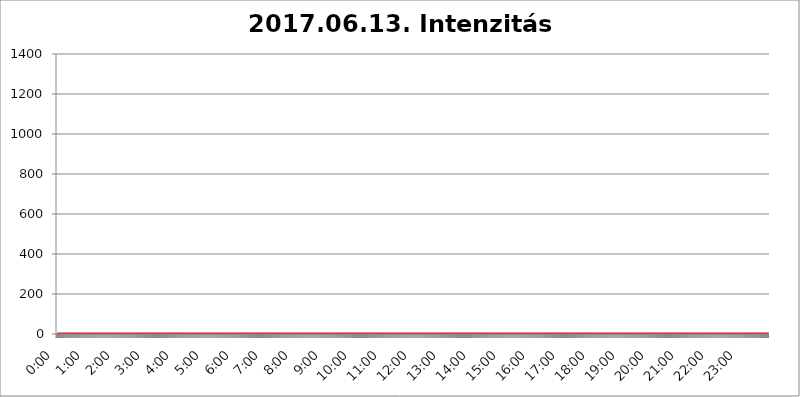
| Category | 2017.06.13. Intenzitás [W/m^2] |
|---|---|
| 0.0 | 0 |
| 0.0006944444444444445 | 0 |
| 0.001388888888888889 | 0 |
| 0.0020833333333333333 | 0 |
| 0.002777777777777778 | 0 |
| 0.003472222222222222 | 0 |
| 0.004166666666666667 | 0 |
| 0.004861111111111111 | 0 |
| 0.005555555555555556 | 0 |
| 0.0062499999999999995 | 0 |
| 0.006944444444444444 | 0 |
| 0.007638888888888889 | 0 |
| 0.008333333333333333 | 0 |
| 0.009027777777777779 | 0 |
| 0.009722222222222222 | 0 |
| 0.010416666666666666 | 0 |
| 0.011111111111111112 | 0 |
| 0.011805555555555555 | 0 |
| 0.012499999999999999 | 0 |
| 0.013194444444444444 | 0 |
| 0.013888888888888888 | 0 |
| 0.014583333333333332 | 0 |
| 0.015277777777777777 | 0 |
| 0.015972222222222224 | 0 |
| 0.016666666666666666 | 0 |
| 0.017361111111111112 | 0 |
| 0.018055555555555557 | 0 |
| 0.01875 | 0 |
| 0.019444444444444445 | 0 |
| 0.02013888888888889 | 0 |
| 0.020833333333333332 | 0 |
| 0.02152777777777778 | 0 |
| 0.022222222222222223 | 0 |
| 0.02291666666666667 | 0 |
| 0.02361111111111111 | 0 |
| 0.024305555555555556 | 0 |
| 0.024999999999999998 | 0 |
| 0.025694444444444447 | 0 |
| 0.02638888888888889 | 0 |
| 0.027083333333333334 | 0 |
| 0.027777777777777776 | 0 |
| 0.02847222222222222 | 0 |
| 0.029166666666666664 | 0 |
| 0.029861111111111113 | 0 |
| 0.030555555555555555 | 0 |
| 0.03125 | 0 |
| 0.03194444444444445 | 0 |
| 0.03263888888888889 | 0 |
| 0.03333333333333333 | 0 |
| 0.034027777777777775 | 0 |
| 0.034722222222222224 | 0 |
| 0.035416666666666666 | 0 |
| 0.036111111111111115 | 0 |
| 0.03680555555555556 | 0 |
| 0.0375 | 0 |
| 0.03819444444444444 | 0 |
| 0.03888888888888889 | 0 |
| 0.03958333333333333 | 0 |
| 0.04027777777777778 | 0 |
| 0.04097222222222222 | 0 |
| 0.041666666666666664 | 0 |
| 0.042361111111111106 | 0 |
| 0.04305555555555556 | 0 |
| 0.043750000000000004 | 0 |
| 0.044444444444444446 | 0 |
| 0.04513888888888889 | 0 |
| 0.04583333333333334 | 0 |
| 0.04652777777777778 | 0 |
| 0.04722222222222222 | 0 |
| 0.04791666666666666 | 0 |
| 0.04861111111111111 | 0 |
| 0.049305555555555554 | 0 |
| 0.049999999999999996 | 0 |
| 0.05069444444444445 | 0 |
| 0.051388888888888894 | 0 |
| 0.052083333333333336 | 0 |
| 0.05277777777777778 | 0 |
| 0.05347222222222222 | 0 |
| 0.05416666666666667 | 0 |
| 0.05486111111111111 | 0 |
| 0.05555555555555555 | 0 |
| 0.05625 | 0 |
| 0.05694444444444444 | 0 |
| 0.057638888888888885 | 0 |
| 0.05833333333333333 | 0 |
| 0.05902777777777778 | 0 |
| 0.059722222222222225 | 0 |
| 0.06041666666666667 | 0 |
| 0.061111111111111116 | 0 |
| 0.06180555555555556 | 0 |
| 0.0625 | 0 |
| 0.06319444444444444 | 0 |
| 0.06388888888888888 | 0 |
| 0.06458333333333334 | 0 |
| 0.06527777777777778 | 0 |
| 0.06597222222222222 | 0 |
| 0.06666666666666667 | 0 |
| 0.06736111111111111 | 0 |
| 0.06805555555555555 | 0 |
| 0.06874999999999999 | 0 |
| 0.06944444444444443 | 0 |
| 0.07013888888888889 | 0 |
| 0.07083333333333333 | 0 |
| 0.07152777777777779 | 0 |
| 0.07222222222222223 | 0 |
| 0.07291666666666667 | 0 |
| 0.07361111111111111 | 0 |
| 0.07430555555555556 | 0 |
| 0.075 | 0 |
| 0.07569444444444444 | 0 |
| 0.0763888888888889 | 0 |
| 0.07708333333333334 | 0 |
| 0.07777777777777778 | 0 |
| 0.07847222222222222 | 0 |
| 0.07916666666666666 | 0 |
| 0.0798611111111111 | 0 |
| 0.08055555555555556 | 0 |
| 0.08125 | 0 |
| 0.08194444444444444 | 0 |
| 0.08263888888888889 | 0 |
| 0.08333333333333333 | 0 |
| 0.08402777777777777 | 0 |
| 0.08472222222222221 | 0 |
| 0.08541666666666665 | 0 |
| 0.08611111111111112 | 0 |
| 0.08680555555555557 | 0 |
| 0.08750000000000001 | 0 |
| 0.08819444444444445 | 0 |
| 0.08888888888888889 | 0 |
| 0.08958333333333333 | 0 |
| 0.09027777777777778 | 0 |
| 0.09097222222222222 | 0 |
| 0.09166666666666667 | 0 |
| 0.09236111111111112 | 0 |
| 0.09305555555555556 | 0 |
| 0.09375 | 0 |
| 0.09444444444444444 | 0 |
| 0.09513888888888888 | 0 |
| 0.09583333333333333 | 0 |
| 0.09652777777777777 | 0 |
| 0.09722222222222222 | 0 |
| 0.09791666666666667 | 0 |
| 0.09861111111111111 | 0 |
| 0.09930555555555555 | 0 |
| 0.09999999999999999 | 0 |
| 0.10069444444444443 | 0 |
| 0.1013888888888889 | 0 |
| 0.10208333333333335 | 0 |
| 0.10277777777777779 | 0 |
| 0.10347222222222223 | 0 |
| 0.10416666666666667 | 0 |
| 0.10486111111111111 | 0 |
| 0.10555555555555556 | 0 |
| 0.10625 | 0 |
| 0.10694444444444444 | 0 |
| 0.1076388888888889 | 0 |
| 0.10833333333333334 | 0 |
| 0.10902777777777778 | 0 |
| 0.10972222222222222 | 0 |
| 0.1111111111111111 | 0 |
| 0.11180555555555556 | 0 |
| 0.11180555555555556 | 0 |
| 0.1125 | 0 |
| 0.11319444444444444 | 0 |
| 0.11388888888888889 | 0 |
| 0.11458333333333333 | 0 |
| 0.11527777777777777 | 0 |
| 0.11597222222222221 | 0 |
| 0.11666666666666665 | 0 |
| 0.1173611111111111 | 0 |
| 0.11805555555555557 | 0 |
| 0.11944444444444445 | 0 |
| 0.12013888888888889 | 0 |
| 0.12083333333333333 | 0 |
| 0.12152777777777778 | 0 |
| 0.12222222222222223 | 0 |
| 0.12291666666666667 | 0 |
| 0.12291666666666667 | 0 |
| 0.12361111111111112 | 0 |
| 0.12430555555555556 | 0 |
| 0.125 | 0 |
| 0.12569444444444444 | 0 |
| 0.12638888888888888 | 0 |
| 0.12708333333333333 | 0 |
| 0.16875 | 0 |
| 0.12847222222222224 | 0 |
| 0.12916666666666668 | 0 |
| 0.12986111111111112 | 0 |
| 0.13055555555555556 | 0 |
| 0.13125 | 0 |
| 0.13194444444444445 | 0 |
| 0.1326388888888889 | 0 |
| 0.13333333333333333 | 0 |
| 0.13402777777777777 | 0 |
| 0.13402777777777777 | 0 |
| 0.13472222222222222 | 0 |
| 0.13541666666666666 | 0 |
| 0.1361111111111111 | 0 |
| 0.13749999999999998 | 0 |
| 0.13819444444444443 | 0 |
| 0.1388888888888889 | 0 |
| 0.13958333333333334 | 0 |
| 0.14027777777777778 | 0 |
| 0.14097222222222222 | 0 |
| 0.14166666666666666 | 0 |
| 0.1423611111111111 | 0 |
| 0.14305555555555557 | 0 |
| 0.14375000000000002 | 0 |
| 0.14444444444444446 | 0 |
| 0.1451388888888889 | 0 |
| 0.1451388888888889 | 0 |
| 0.14652777777777778 | 0 |
| 0.14722222222222223 | 0 |
| 0.14791666666666667 | 0 |
| 0.1486111111111111 | 0 |
| 0.14930555555555555 | 0 |
| 0.15 | 0 |
| 0.15069444444444444 | 0 |
| 0.15138888888888888 | 0 |
| 0.15208333333333332 | 0 |
| 0.15277777777777776 | 0 |
| 0.15347222222222223 | 0 |
| 0.15416666666666667 | 0 |
| 0.15486111111111112 | 0 |
| 0.15555555555555556 | 0 |
| 0.15625 | 0 |
| 0.15694444444444444 | 0 |
| 0.15763888888888888 | 0 |
| 0.15833333333333333 | 0 |
| 0.15902777777777777 | 0 |
| 0.15972222222222224 | 0 |
| 0.16041666666666668 | 0 |
| 0.16111111111111112 | 0 |
| 0.16180555555555556 | 0 |
| 0.1625 | 0 |
| 0.16319444444444445 | 0 |
| 0.1638888888888889 | 0 |
| 0.16458333333333333 | 0 |
| 0.16527777777777777 | 0 |
| 0.16597222222222222 | 0 |
| 0.16666666666666666 | 0 |
| 0.1673611111111111 | 0 |
| 0.16805555555555554 | 0 |
| 0.16874999999999998 | 0 |
| 0.16944444444444443 | 0 |
| 0.17013888888888887 | 0 |
| 0.1708333333333333 | 0 |
| 0.17152777777777775 | 0 |
| 0.17222222222222225 | 0 |
| 0.1729166666666667 | 0 |
| 0.17361111111111113 | 0 |
| 0.17430555555555557 | 0 |
| 0.17500000000000002 | 0 |
| 0.17569444444444446 | 0 |
| 0.1763888888888889 | 0 |
| 0.17708333333333334 | 0 |
| 0.17777777777777778 | 0 |
| 0.17847222222222223 | 0 |
| 0.17916666666666667 | 0 |
| 0.1798611111111111 | 0 |
| 0.18055555555555555 | 0 |
| 0.18125 | 0 |
| 0.18194444444444444 | 0 |
| 0.1826388888888889 | 0 |
| 0.18333333333333335 | 0 |
| 0.1840277777777778 | 0 |
| 0.18472222222222223 | 0 |
| 0.18541666666666667 | 0 |
| 0.18611111111111112 | 0 |
| 0.18680555555555556 | 0 |
| 0.1875 | 0 |
| 0.18819444444444444 | 0 |
| 0.18888888888888888 | 0 |
| 0.18958333333333333 | 0 |
| 0.19027777777777777 | 0 |
| 0.1909722222222222 | 0 |
| 0.19166666666666665 | 0 |
| 0.19236111111111112 | 0 |
| 0.19305555555555554 | 0 |
| 0.19375 | 0 |
| 0.19444444444444445 | 0 |
| 0.1951388888888889 | 0 |
| 0.19583333333333333 | 0 |
| 0.19652777777777777 | 0 |
| 0.19722222222222222 | 0 |
| 0.19791666666666666 | 0 |
| 0.1986111111111111 | 0 |
| 0.19930555555555554 | 0 |
| 0.19999999999999998 | 0 |
| 0.20069444444444443 | 0 |
| 0.20138888888888887 | 0 |
| 0.2020833333333333 | 0 |
| 0.2027777777777778 | 0 |
| 0.2034722222222222 | 0 |
| 0.2041666666666667 | 0 |
| 0.20486111111111113 | 0 |
| 0.20555555555555557 | 0 |
| 0.20625000000000002 | 0 |
| 0.20694444444444446 | 0 |
| 0.2076388888888889 | 0 |
| 0.20833333333333334 | 0 |
| 0.20902777777777778 | 0 |
| 0.20972222222222223 | 0 |
| 0.21041666666666667 | 0 |
| 0.2111111111111111 | 0 |
| 0.21180555555555555 | 0 |
| 0.2125 | 0 |
| 0.21319444444444444 | 0 |
| 0.2138888888888889 | 0 |
| 0.21458333333333335 | 0 |
| 0.2152777777777778 | 0 |
| 0.21597222222222223 | 0 |
| 0.21666666666666667 | 0 |
| 0.21736111111111112 | 0 |
| 0.21805555555555556 | 0 |
| 0.21875 | 0 |
| 0.21944444444444444 | 0 |
| 0.22013888888888888 | 0 |
| 0.22083333333333333 | 0 |
| 0.22152777777777777 | 0 |
| 0.2222222222222222 | 0 |
| 0.22291666666666665 | 0 |
| 0.2236111111111111 | 0 |
| 0.22430555555555556 | 0 |
| 0.225 | 0 |
| 0.22569444444444445 | 0 |
| 0.2263888888888889 | 0 |
| 0.22708333333333333 | 0 |
| 0.22777777777777777 | 0 |
| 0.22847222222222222 | 0 |
| 0.22916666666666666 | 0 |
| 0.2298611111111111 | 0 |
| 0.23055555555555554 | 0 |
| 0.23124999999999998 | 0 |
| 0.23194444444444443 | 0 |
| 0.23263888888888887 | 0 |
| 0.2333333333333333 | 0 |
| 0.2340277777777778 | 0 |
| 0.2347222222222222 | 0 |
| 0.2354166666666667 | 0 |
| 0.23611111111111113 | 0 |
| 0.23680555555555557 | 0 |
| 0.23750000000000002 | 0 |
| 0.23819444444444446 | 0 |
| 0.2388888888888889 | 0 |
| 0.23958333333333334 | 0 |
| 0.24027777777777778 | 0 |
| 0.24097222222222223 | 0 |
| 0.24166666666666667 | 0 |
| 0.2423611111111111 | 0 |
| 0.24305555555555555 | 0 |
| 0.24375 | 0 |
| 0.24444444444444446 | 0 |
| 0.24513888888888888 | 0 |
| 0.24583333333333335 | 0 |
| 0.2465277777777778 | 0 |
| 0.24722222222222223 | 0 |
| 0.24791666666666667 | 0 |
| 0.24861111111111112 | 0 |
| 0.24930555555555556 | 0 |
| 0.25 | 0 |
| 0.25069444444444444 | 0 |
| 0.2513888888888889 | 0 |
| 0.2520833333333333 | 0 |
| 0.25277777777777777 | 0 |
| 0.2534722222222222 | 0 |
| 0.25416666666666665 | 0 |
| 0.2548611111111111 | 0 |
| 0.2555555555555556 | 0 |
| 0.25625000000000003 | 0 |
| 0.2569444444444445 | 0 |
| 0.2576388888888889 | 0 |
| 0.25833333333333336 | 0 |
| 0.2590277777777778 | 0 |
| 0.25972222222222224 | 0 |
| 0.2604166666666667 | 0 |
| 0.2611111111111111 | 0 |
| 0.26180555555555557 | 0 |
| 0.2625 | 0 |
| 0.26319444444444445 | 0 |
| 0.2638888888888889 | 0 |
| 0.26458333333333334 | 0 |
| 0.2652777777777778 | 0 |
| 0.2659722222222222 | 0 |
| 0.26666666666666666 | 0 |
| 0.2673611111111111 | 0 |
| 0.26805555555555555 | 0 |
| 0.26875 | 0 |
| 0.26944444444444443 | 0 |
| 0.2701388888888889 | 0 |
| 0.2708333333333333 | 0 |
| 0.27152777777777776 | 0 |
| 0.2722222222222222 | 0 |
| 0.27291666666666664 | 0 |
| 0.2736111111111111 | 0 |
| 0.2743055555555555 | 0 |
| 0.27499999999999997 | 0 |
| 0.27569444444444446 | 0 |
| 0.27638888888888885 | 0 |
| 0.27708333333333335 | 0 |
| 0.2777777777777778 | 0 |
| 0.27847222222222223 | 0 |
| 0.2791666666666667 | 0 |
| 0.2798611111111111 | 0 |
| 0.28055555555555556 | 0 |
| 0.28125 | 0 |
| 0.28194444444444444 | 0 |
| 0.2826388888888889 | 0 |
| 0.2833333333333333 | 0 |
| 0.28402777777777777 | 0 |
| 0.2847222222222222 | 0 |
| 0.28541666666666665 | 0 |
| 0.28611111111111115 | 0 |
| 0.28680555555555554 | 0 |
| 0.28750000000000003 | 0 |
| 0.2881944444444445 | 0 |
| 0.2888888888888889 | 0 |
| 0.28958333333333336 | 0 |
| 0.2902777777777778 | 0 |
| 0.29097222222222224 | 0 |
| 0.2916666666666667 | 0 |
| 0.2923611111111111 | 0 |
| 0.29305555555555557 | 0 |
| 0.29375 | 0 |
| 0.29444444444444445 | 0 |
| 0.2951388888888889 | 0 |
| 0.29583333333333334 | 0 |
| 0.2965277777777778 | 0 |
| 0.2972222222222222 | 0 |
| 0.29791666666666666 | 0 |
| 0.2986111111111111 | 0 |
| 0.29930555555555555 | 0 |
| 0.3 | 0 |
| 0.30069444444444443 | 0 |
| 0.3013888888888889 | 0 |
| 0.3020833333333333 | 0 |
| 0.30277777777777776 | 0 |
| 0.3034722222222222 | 0 |
| 0.30416666666666664 | 0 |
| 0.3048611111111111 | 0 |
| 0.3055555555555555 | 0 |
| 0.30624999999999997 | 0 |
| 0.3069444444444444 | 0 |
| 0.3076388888888889 | 0 |
| 0.30833333333333335 | 0 |
| 0.3090277777777778 | 0 |
| 0.30972222222222223 | 0 |
| 0.3104166666666667 | 0 |
| 0.3111111111111111 | 0 |
| 0.31180555555555556 | 0 |
| 0.3125 | 0 |
| 0.31319444444444444 | 0 |
| 0.3138888888888889 | 0 |
| 0.3145833333333333 | 0 |
| 0.31527777777777777 | 0 |
| 0.3159722222222222 | 0 |
| 0.31666666666666665 | 0 |
| 0.31736111111111115 | 0 |
| 0.31805555555555554 | 0 |
| 0.31875000000000003 | 0 |
| 0.3194444444444445 | 0 |
| 0.3201388888888889 | 0 |
| 0.32083333333333336 | 0 |
| 0.3215277777777778 | 0 |
| 0.32222222222222224 | 0 |
| 0.3229166666666667 | 0 |
| 0.3236111111111111 | 0 |
| 0.32430555555555557 | 0 |
| 0.325 | 0 |
| 0.32569444444444445 | 0 |
| 0.3263888888888889 | 0 |
| 0.32708333333333334 | 0 |
| 0.3277777777777778 | 0 |
| 0.3284722222222222 | 0 |
| 0.32916666666666666 | 0 |
| 0.3298611111111111 | 0 |
| 0.33055555555555555 | 0 |
| 0.33125 | 0 |
| 0.33194444444444443 | 0 |
| 0.3326388888888889 | 0 |
| 0.3333333333333333 | 0 |
| 0.3340277777777778 | 0 |
| 0.3347222222222222 | 0 |
| 0.3354166666666667 | 0 |
| 0.3361111111111111 | 0 |
| 0.3368055555555556 | 0 |
| 0.33749999999999997 | 0 |
| 0.33819444444444446 | 0 |
| 0.33888888888888885 | 0 |
| 0.33958333333333335 | 0 |
| 0.34027777777777773 | 0 |
| 0.34097222222222223 | 0 |
| 0.3416666666666666 | 0 |
| 0.3423611111111111 | 0 |
| 0.3430555555555555 | 0 |
| 0.34375 | 0 |
| 0.3444444444444445 | 0 |
| 0.3451388888888889 | 0 |
| 0.3458333333333334 | 0 |
| 0.34652777777777777 | 0 |
| 0.34722222222222227 | 0 |
| 0.34791666666666665 | 0 |
| 0.34861111111111115 | 0 |
| 0.34930555555555554 | 0 |
| 0.35000000000000003 | 0 |
| 0.3506944444444444 | 0 |
| 0.3513888888888889 | 0 |
| 0.3520833333333333 | 0 |
| 0.3527777777777778 | 0 |
| 0.3534722222222222 | 0 |
| 0.3541666666666667 | 0 |
| 0.3548611111111111 | 0 |
| 0.35555555555555557 | 0 |
| 0.35625 | 0 |
| 0.35694444444444445 | 0 |
| 0.3576388888888889 | 0 |
| 0.35833333333333334 | 0 |
| 0.3590277777777778 | 0 |
| 0.3597222222222222 | 0 |
| 0.36041666666666666 | 0 |
| 0.3611111111111111 | 0 |
| 0.36180555555555555 | 0 |
| 0.3625 | 0 |
| 0.36319444444444443 | 0 |
| 0.3638888888888889 | 0 |
| 0.3645833333333333 | 0 |
| 0.3652777777777778 | 0 |
| 0.3659722222222222 | 0 |
| 0.3666666666666667 | 0 |
| 0.3673611111111111 | 0 |
| 0.3680555555555556 | 0 |
| 0.36874999999999997 | 0 |
| 0.36944444444444446 | 0 |
| 0.37013888888888885 | 0 |
| 0.37083333333333335 | 0 |
| 0.37152777777777773 | 0 |
| 0.37222222222222223 | 0 |
| 0.3729166666666666 | 0 |
| 0.3736111111111111 | 0 |
| 0.3743055555555555 | 0 |
| 0.375 | 0 |
| 0.3756944444444445 | 0 |
| 0.3763888888888889 | 0 |
| 0.3770833333333334 | 0 |
| 0.37777777777777777 | 0 |
| 0.37847222222222227 | 0 |
| 0.37916666666666665 | 0 |
| 0.37986111111111115 | 0 |
| 0.38055555555555554 | 0 |
| 0.38125000000000003 | 0 |
| 0.3819444444444444 | 0 |
| 0.3826388888888889 | 0 |
| 0.3833333333333333 | 0 |
| 0.3840277777777778 | 0 |
| 0.3847222222222222 | 0 |
| 0.3854166666666667 | 0 |
| 0.3861111111111111 | 0 |
| 0.38680555555555557 | 0 |
| 0.3875 | 0 |
| 0.38819444444444445 | 0 |
| 0.3888888888888889 | 0 |
| 0.38958333333333334 | 0 |
| 0.3902777777777778 | 0 |
| 0.3909722222222222 | 0 |
| 0.39166666666666666 | 0 |
| 0.3923611111111111 | 0 |
| 0.39305555555555555 | 0 |
| 0.39375 | 0 |
| 0.39444444444444443 | 0 |
| 0.3951388888888889 | 0 |
| 0.3958333333333333 | 0 |
| 0.3965277777777778 | 0 |
| 0.3972222222222222 | 0 |
| 0.3979166666666667 | 0 |
| 0.3986111111111111 | 0 |
| 0.3993055555555556 | 0 |
| 0.39999999999999997 | 0 |
| 0.40069444444444446 | 0 |
| 0.40138888888888885 | 0 |
| 0.40208333333333335 | 0 |
| 0.40277777777777773 | 0 |
| 0.40347222222222223 | 0 |
| 0.4041666666666666 | 0 |
| 0.4048611111111111 | 0 |
| 0.4055555555555555 | 0 |
| 0.40625 | 0 |
| 0.4069444444444445 | 0 |
| 0.4076388888888889 | 0 |
| 0.4083333333333334 | 0 |
| 0.40902777777777777 | 0 |
| 0.40972222222222227 | 0 |
| 0.41041666666666665 | 0 |
| 0.41111111111111115 | 0 |
| 0.41180555555555554 | 0 |
| 0.41250000000000003 | 0 |
| 0.4131944444444444 | 0 |
| 0.4138888888888889 | 0 |
| 0.4145833333333333 | 0 |
| 0.4152777777777778 | 0 |
| 0.4159722222222222 | 0 |
| 0.4166666666666667 | 0 |
| 0.4173611111111111 | 0 |
| 0.41805555555555557 | 0 |
| 0.41875 | 0 |
| 0.41944444444444445 | 0 |
| 0.4201388888888889 | 0 |
| 0.42083333333333334 | 0 |
| 0.4215277777777778 | 0 |
| 0.4222222222222222 | 0 |
| 0.42291666666666666 | 0 |
| 0.4236111111111111 | 0 |
| 0.42430555555555555 | 0 |
| 0.425 | 0 |
| 0.42569444444444443 | 0 |
| 0.4263888888888889 | 0 |
| 0.4270833333333333 | 0 |
| 0.4277777777777778 | 0 |
| 0.4284722222222222 | 0 |
| 0.4291666666666667 | 0 |
| 0.4298611111111111 | 0 |
| 0.4305555555555556 | 0 |
| 0.43124999999999997 | 0 |
| 0.43194444444444446 | 0 |
| 0.43263888888888885 | 0 |
| 0.43333333333333335 | 0 |
| 0.43402777777777773 | 0 |
| 0.43472222222222223 | 0 |
| 0.4354166666666666 | 0 |
| 0.4361111111111111 | 0 |
| 0.4368055555555555 | 0 |
| 0.4375 | 0 |
| 0.4381944444444445 | 0 |
| 0.4388888888888889 | 0 |
| 0.4395833333333334 | 0 |
| 0.44027777777777777 | 0 |
| 0.44097222222222227 | 0 |
| 0.44166666666666665 | 0 |
| 0.44236111111111115 | 0 |
| 0.44305555555555554 | 0 |
| 0.44375000000000003 | 0 |
| 0.4444444444444444 | 0 |
| 0.4451388888888889 | 0 |
| 0.4458333333333333 | 0 |
| 0.4465277777777778 | 0 |
| 0.4472222222222222 | 0 |
| 0.4479166666666667 | 0 |
| 0.4486111111111111 | 0 |
| 0.44930555555555557 | 0 |
| 0.45 | 0 |
| 0.45069444444444445 | 0 |
| 0.4513888888888889 | 0 |
| 0.45208333333333334 | 0 |
| 0.4527777777777778 | 0 |
| 0.4534722222222222 | 0 |
| 0.45416666666666666 | 0 |
| 0.4548611111111111 | 0 |
| 0.45555555555555555 | 0 |
| 0.45625 | 0 |
| 0.45694444444444443 | 0 |
| 0.4576388888888889 | 0 |
| 0.4583333333333333 | 0 |
| 0.4590277777777778 | 0 |
| 0.4597222222222222 | 0 |
| 0.4604166666666667 | 0 |
| 0.4611111111111111 | 0 |
| 0.4618055555555556 | 0 |
| 0.46249999999999997 | 0 |
| 0.46319444444444446 | 0 |
| 0.46388888888888885 | 0 |
| 0.46458333333333335 | 0 |
| 0.46527777777777773 | 0 |
| 0.46597222222222223 | 0 |
| 0.4666666666666666 | 0 |
| 0.4673611111111111 | 0 |
| 0.4680555555555555 | 0 |
| 0.46875 | 0 |
| 0.4694444444444445 | 0 |
| 0.4701388888888889 | 0 |
| 0.4708333333333334 | 0 |
| 0.47152777777777777 | 0 |
| 0.47222222222222227 | 0 |
| 0.47291666666666665 | 0 |
| 0.47361111111111115 | 0 |
| 0.47430555555555554 | 0 |
| 0.47500000000000003 | 0 |
| 0.4756944444444444 | 0 |
| 0.4763888888888889 | 0 |
| 0.4770833333333333 | 0 |
| 0.4777777777777778 | 0 |
| 0.4784722222222222 | 0 |
| 0.4791666666666667 | 0 |
| 0.4798611111111111 | 0 |
| 0.48055555555555557 | 0 |
| 0.48125 | 0 |
| 0.48194444444444445 | 0 |
| 0.4826388888888889 | 0 |
| 0.48333333333333334 | 0 |
| 0.4840277777777778 | 0 |
| 0.4847222222222222 | 0 |
| 0.48541666666666666 | 0 |
| 0.4861111111111111 | 0 |
| 0.48680555555555555 | 0 |
| 0.4875 | 0 |
| 0.48819444444444443 | 0 |
| 0.4888888888888889 | 0 |
| 0.4895833333333333 | 0 |
| 0.4902777777777778 | 0 |
| 0.4909722222222222 | 0 |
| 0.4916666666666667 | 0 |
| 0.4923611111111111 | 0 |
| 0.4930555555555556 | 0 |
| 0.49374999999999997 | 0 |
| 0.49444444444444446 | 0 |
| 0.49513888888888885 | 0 |
| 0.49583333333333335 | 0 |
| 0.49652777777777773 | 0 |
| 0.49722222222222223 | 0 |
| 0.4979166666666666 | 0 |
| 0.4986111111111111 | 0 |
| 0.4993055555555555 | 0 |
| 0.5 | 0 |
| 0.5006944444444444 | 0 |
| 0.5013888888888889 | 0 |
| 0.5020833333333333 | 0 |
| 0.5027777777777778 | 0 |
| 0.5034722222222222 | 0 |
| 0.5041666666666667 | 0 |
| 0.5048611111111111 | 0 |
| 0.5055555555555555 | 0 |
| 0.50625 | 0 |
| 0.5069444444444444 | 0 |
| 0.5076388888888889 | 0 |
| 0.5083333333333333 | 0 |
| 0.5090277777777777 | 0 |
| 0.5097222222222222 | 0 |
| 0.5104166666666666 | 0 |
| 0.5111111111111112 | 0 |
| 0.5118055555555555 | 0 |
| 0.5125000000000001 | 0 |
| 0.5131944444444444 | 0 |
| 0.513888888888889 | 0 |
| 0.5145833333333333 | 0 |
| 0.5152777777777778 | 0 |
| 0.5159722222222222 | 0 |
| 0.5166666666666667 | 0 |
| 0.517361111111111 | 0 |
| 0.5180555555555556 | 0 |
| 0.5187499999999999 | 0 |
| 0.5194444444444445 | 0 |
| 0.5201388888888888 | 0 |
| 0.5208333333333334 | 0 |
| 0.5215277777777778 | 0 |
| 0.5222222222222223 | 0 |
| 0.5229166666666667 | 0 |
| 0.5236111111111111 | 0 |
| 0.5243055555555556 | 0 |
| 0.525 | 0 |
| 0.5256944444444445 | 0 |
| 0.5263888888888889 | 0 |
| 0.5270833333333333 | 0 |
| 0.5277777777777778 | 0 |
| 0.5284722222222222 | 0 |
| 0.5291666666666667 | 0 |
| 0.5298611111111111 | 0 |
| 0.5305555555555556 | 0 |
| 0.53125 | 0 |
| 0.5319444444444444 | 0 |
| 0.5326388888888889 | 0 |
| 0.5333333333333333 | 0 |
| 0.5340277777777778 | 0 |
| 0.5347222222222222 | 0 |
| 0.5354166666666667 | 0 |
| 0.5361111111111111 | 0 |
| 0.5368055555555555 | 0 |
| 0.5375 | 0 |
| 0.5381944444444444 | 0 |
| 0.5388888888888889 | 0 |
| 0.5395833333333333 | 0 |
| 0.5402777777777777 | 0 |
| 0.5409722222222222 | 0 |
| 0.5416666666666666 | 0 |
| 0.5423611111111112 | 0 |
| 0.5430555555555555 | 0 |
| 0.5437500000000001 | 0 |
| 0.5444444444444444 | 0 |
| 0.545138888888889 | 0 |
| 0.5458333333333333 | 0 |
| 0.5465277777777778 | 0 |
| 0.5472222222222222 | 0 |
| 0.5479166666666667 | 0 |
| 0.548611111111111 | 0 |
| 0.5493055555555556 | 0 |
| 0.5499999999999999 | 0 |
| 0.5506944444444445 | 0 |
| 0.5513888888888888 | 0 |
| 0.5520833333333334 | 0 |
| 0.5527777777777778 | 0 |
| 0.5534722222222223 | 0 |
| 0.5541666666666667 | 0 |
| 0.5548611111111111 | 0 |
| 0.5555555555555556 | 0 |
| 0.55625 | 0 |
| 0.5569444444444445 | 0 |
| 0.5576388888888889 | 0 |
| 0.5583333333333333 | 0 |
| 0.5590277777777778 | 0 |
| 0.5597222222222222 | 0 |
| 0.5604166666666667 | 0 |
| 0.5611111111111111 | 0 |
| 0.5618055555555556 | 0 |
| 0.5625 | 0 |
| 0.5631944444444444 | 0 |
| 0.5638888888888889 | 0 |
| 0.5645833333333333 | 0 |
| 0.5652777777777778 | 0 |
| 0.5659722222222222 | 0 |
| 0.5666666666666667 | 0 |
| 0.5673611111111111 | 0 |
| 0.5680555555555555 | 0 |
| 0.56875 | 0 |
| 0.5694444444444444 | 0 |
| 0.5701388888888889 | 0 |
| 0.5708333333333333 | 0 |
| 0.5715277777777777 | 0 |
| 0.5722222222222222 | 0 |
| 0.5729166666666666 | 0 |
| 0.5736111111111112 | 0 |
| 0.5743055555555555 | 0 |
| 0.5750000000000001 | 0 |
| 0.5756944444444444 | 0 |
| 0.576388888888889 | 0 |
| 0.5770833333333333 | 0 |
| 0.5777777777777778 | 0 |
| 0.5784722222222222 | 0 |
| 0.5791666666666667 | 0 |
| 0.579861111111111 | 0 |
| 0.5805555555555556 | 0 |
| 0.5812499999999999 | 0 |
| 0.5819444444444445 | 0 |
| 0.5826388888888888 | 0 |
| 0.5833333333333334 | 0 |
| 0.5840277777777778 | 0 |
| 0.5847222222222223 | 0 |
| 0.5854166666666667 | 0 |
| 0.5861111111111111 | 0 |
| 0.5868055555555556 | 0 |
| 0.5875 | 0 |
| 0.5881944444444445 | 0 |
| 0.5888888888888889 | 0 |
| 0.5895833333333333 | 0 |
| 0.5902777777777778 | 0 |
| 0.5909722222222222 | 0 |
| 0.5916666666666667 | 0 |
| 0.5923611111111111 | 0 |
| 0.5930555555555556 | 0 |
| 0.59375 | 0 |
| 0.5944444444444444 | 0 |
| 0.5951388888888889 | 0 |
| 0.5958333333333333 | 0 |
| 0.5965277777777778 | 0 |
| 0.5972222222222222 | 0 |
| 0.5979166666666667 | 0 |
| 0.5986111111111111 | 0 |
| 0.5993055555555555 | 0 |
| 0.6 | 0 |
| 0.6006944444444444 | 0 |
| 0.6013888888888889 | 0 |
| 0.6020833333333333 | 0 |
| 0.6027777777777777 | 0 |
| 0.6034722222222222 | 0 |
| 0.6041666666666666 | 0 |
| 0.6048611111111112 | 0 |
| 0.6055555555555555 | 0 |
| 0.6062500000000001 | 0 |
| 0.6069444444444444 | 0 |
| 0.607638888888889 | 0 |
| 0.6083333333333333 | 0 |
| 0.6090277777777778 | 0 |
| 0.6097222222222222 | 0 |
| 0.6104166666666667 | 0 |
| 0.611111111111111 | 0 |
| 0.6118055555555556 | 0 |
| 0.6124999999999999 | 0 |
| 0.6131944444444445 | 0 |
| 0.6138888888888888 | 0 |
| 0.6145833333333334 | 0 |
| 0.6152777777777778 | 0 |
| 0.6159722222222223 | 0 |
| 0.6166666666666667 | 0 |
| 0.6173611111111111 | 0 |
| 0.6180555555555556 | 0 |
| 0.61875 | 0 |
| 0.6194444444444445 | 0 |
| 0.6201388888888889 | 0 |
| 0.6208333333333333 | 0 |
| 0.6215277777777778 | 0 |
| 0.6222222222222222 | 0 |
| 0.6229166666666667 | 0 |
| 0.6236111111111111 | 0 |
| 0.6243055555555556 | 0 |
| 0.625 | 0 |
| 0.6256944444444444 | 0 |
| 0.6263888888888889 | 0 |
| 0.6270833333333333 | 0 |
| 0.6277777777777778 | 0 |
| 0.6284722222222222 | 0 |
| 0.6291666666666667 | 0 |
| 0.6298611111111111 | 0 |
| 0.6305555555555555 | 0 |
| 0.63125 | 0 |
| 0.6319444444444444 | 0 |
| 0.6326388888888889 | 0 |
| 0.6333333333333333 | 0 |
| 0.6340277777777777 | 0 |
| 0.6347222222222222 | 0 |
| 0.6354166666666666 | 0 |
| 0.6361111111111112 | 0 |
| 0.6368055555555555 | 0 |
| 0.6375000000000001 | 0 |
| 0.6381944444444444 | 0 |
| 0.638888888888889 | 0 |
| 0.6395833333333333 | 0 |
| 0.6402777777777778 | 0 |
| 0.6409722222222222 | 0 |
| 0.6416666666666667 | 0 |
| 0.642361111111111 | 0 |
| 0.6430555555555556 | 0 |
| 0.6437499999999999 | 0 |
| 0.6444444444444445 | 0 |
| 0.6451388888888888 | 0 |
| 0.6458333333333334 | 0 |
| 0.6465277777777778 | 0 |
| 0.6472222222222223 | 0 |
| 0.6479166666666667 | 0 |
| 0.6486111111111111 | 0 |
| 0.6493055555555556 | 0 |
| 0.65 | 0 |
| 0.6506944444444445 | 0 |
| 0.6513888888888889 | 0 |
| 0.6520833333333333 | 0 |
| 0.6527777777777778 | 0 |
| 0.6534722222222222 | 0 |
| 0.6541666666666667 | 0 |
| 0.6548611111111111 | 0 |
| 0.6555555555555556 | 0 |
| 0.65625 | 0 |
| 0.6569444444444444 | 0 |
| 0.6576388888888889 | 0 |
| 0.6583333333333333 | 0 |
| 0.6590277777777778 | 0 |
| 0.6597222222222222 | 0 |
| 0.6604166666666667 | 0 |
| 0.6611111111111111 | 0 |
| 0.6618055555555555 | 0 |
| 0.6625 | 0 |
| 0.6631944444444444 | 0 |
| 0.6638888888888889 | 0 |
| 0.6645833333333333 | 0 |
| 0.6652777777777777 | 0 |
| 0.6659722222222222 | 0 |
| 0.6666666666666666 | 0 |
| 0.6673611111111111 | 0 |
| 0.6680555555555556 | 0 |
| 0.6687500000000001 | 0 |
| 0.6694444444444444 | 0 |
| 0.6701388888888888 | 0 |
| 0.6708333333333334 | 0 |
| 0.6715277777777778 | 0 |
| 0.6722222222222222 | 0 |
| 0.6729166666666666 | 0 |
| 0.6736111111111112 | 0 |
| 0.6743055555555556 | 0 |
| 0.6749999999999999 | 0 |
| 0.6756944444444444 | 0 |
| 0.6763888888888889 | 0 |
| 0.6770833333333334 | 0 |
| 0.6777777777777777 | 0 |
| 0.6784722222222223 | 0 |
| 0.6791666666666667 | 0 |
| 0.6798611111111111 | 0 |
| 0.6805555555555555 | 0 |
| 0.68125 | 0 |
| 0.6819444444444445 | 0 |
| 0.6826388888888889 | 0 |
| 0.6833333333333332 | 0 |
| 0.6840277777777778 | 0 |
| 0.6847222222222222 | 0 |
| 0.6854166666666667 | 0 |
| 0.686111111111111 | 0 |
| 0.6868055555555556 | 0 |
| 0.6875 | 0 |
| 0.6881944444444444 | 0 |
| 0.688888888888889 | 0 |
| 0.6895833333333333 | 0 |
| 0.6902777777777778 | 0 |
| 0.6909722222222222 | 0 |
| 0.6916666666666668 | 0 |
| 0.6923611111111111 | 0 |
| 0.6930555555555555 | 0 |
| 0.69375 | 0 |
| 0.6944444444444445 | 0 |
| 0.6951388888888889 | 0 |
| 0.6958333333333333 | 0 |
| 0.6965277777777777 | 0 |
| 0.6972222222222223 | 0 |
| 0.6979166666666666 | 0 |
| 0.6986111111111111 | 0 |
| 0.6993055555555556 | 0 |
| 0.7000000000000001 | 0 |
| 0.7006944444444444 | 0 |
| 0.7013888888888888 | 0 |
| 0.7020833333333334 | 0 |
| 0.7027777777777778 | 0 |
| 0.7034722222222222 | 0 |
| 0.7041666666666666 | 0 |
| 0.7048611111111112 | 0 |
| 0.7055555555555556 | 0 |
| 0.7062499999999999 | 0 |
| 0.7069444444444444 | 0 |
| 0.7076388888888889 | 0 |
| 0.7083333333333334 | 0 |
| 0.7090277777777777 | 0 |
| 0.7097222222222223 | 0 |
| 0.7104166666666667 | 0 |
| 0.7111111111111111 | 0 |
| 0.7118055555555555 | 0 |
| 0.7125 | 0 |
| 0.7131944444444445 | 0 |
| 0.7138888888888889 | 0 |
| 0.7145833333333332 | 0 |
| 0.7152777777777778 | 0 |
| 0.7159722222222222 | 0 |
| 0.7166666666666667 | 0 |
| 0.717361111111111 | 0 |
| 0.7180555555555556 | 0 |
| 0.71875 | 0 |
| 0.7194444444444444 | 0 |
| 0.720138888888889 | 0 |
| 0.7208333333333333 | 0 |
| 0.7215277777777778 | 0 |
| 0.7222222222222222 | 0 |
| 0.7229166666666668 | 0 |
| 0.7236111111111111 | 0 |
| 0.7243055555555555 | 0 |
| 0.725 | 0 |
| 0.7256944444444445 | 0 |
| 0.7263888888888889 | 0 |
| 0.7270833333333333 | 0 |
| 0.7277777777777777 | 0 |
| 0.7284722222222223 | 0 |
| 0.7291666666666666 | 0 |
| 0.7298611111111111 | 0 |
| 0.7305555555555556 | 0 |
| 0.7312500000000001 | 0 |
| 0.7319444444444444 | 0 |
| 0.7326388888888888 | 0 |
| 0.7333333333333334 | 0 |
| 0.7340277777777778 | 0 |
| 0.7347222222222222 | 0 |
| 0.7354166666666666 | 0 |
| 0.7361111111111112 | 0 |
| 0.7368055555555556 | 0 |
| 0.7374999999999999 | 0 |
| 0.7381944444444444 | 0 |
| 0.7388888888888889 | 0 |
| 0.7395833333333334 | 0 |
| 0.7402777777777777 | 0 |
| 0.7409722222222223 | 0 |
| 0.7416666666666667 | 0 |
| 0.7423611111111111 | 0 |
| 0.7430555555555555 | 0 |
| 0.74375 | 0 |
| 0.7444444444444445 | 0 |
| 0.7451388888888889 | 0 |
| 0.7458333333333332 | 0 |
| 0.7465277777777778 | 0 |
| 0.7472222222222222 | 0 |
| 0.7479166666666667 | 0 |
| 0.748611111111111 | 0 |
| 0.7493055555555556 | 0 |
| 0.75 | 0 |
| 0.7506944444444444 | 0 |
| 0.751388888888889 | 0 |
| 0.7520833333333333 | 0 |
| 0.7527777777777778 | 0 |
| 0.7534722222222222 | 0 |
| 0.7541666666666668 | 0 |
| 0.7548611111111111 | 0 |
| 0.7555555555555555 | 0 |
| 0.75625 | 0 |
| 0.7569444444444445 | 0 |
| 0.7576388888888889 | 0 |
| 0.7583333333333333 | 0 |
| 0.7590277777777777 | 0 |
| 0.7597222222222223 | 0 |
| 0.7604166666666666 | 0 |
| 0.7611111111111111 | 0 |
| 0.7618055555555556 | 0 |
| 0.7625000000000001 | 0 |
| 0.7631944444444444 | 0 |
| 0.7638888888888888 | 0 |
| 0.7645833333333334 | 0 |
| 0.7652777777777778 | 0 |
| 0.7659722222222222 | 0 |
| 0.7666666666666666 | 0 |
| 0.7673611111111112 | 0 |
| 0.7680555555555556 | 0 |
| 0.7687499999999999 | 0 |
| 0.7694444444444444 | 0 |
| 0.7701388888888889 | 0 |
| 0.7708333333333334 | 0 |
| 0.7715277777777777 | 0 |
| 0.7722222222222223 | 0 |
| 0.7729166666666667 | 0 |
| 0.7736111111111111 | 0 |
| 0.7743055555555555 | 0 |
| 0.775 | 0 |
| 0.7756944444444445 | 0 |
| 0.7763888888888889 | 0 |
| 0.7770833333333332 | 0 |
| 0.7777777777777778 | 0 |
| 0.7784722222222222 | 0 |
| 0.7791666666666667 | 0 |
| 0.779861111111111 | 0 |
| 0.7805555555555556 | 0 |
| 0.78125 | 0 |
| 0.7819444444444444 | 0 |
| 0.782638888888889 | 0 |
| 0.7833333333333333 | 0 |
| 0.7840277777777778 | 0 |
| 0.7847222222222222 | 0 |
| 0.7854166666666668 | 0 |
| 0.7861111111111111 | 0 |
| 0.7868055555555555 | 0 |
| 0.7875 | 0 |
| 0.7881944444444445 | 0 |
| 0.7888888888888889 | 0 |
| 0.7895833333333333 | 0 |
| 0.7902777777777777 | 0 |
| 0.7909722222222223 | 0 |
| 0.7916666666666666 | 0 |
| 0.7923611111111111 | 0 |
| 0.7930555555555556 | 0 |
| 0.7937500000000001 | 0 |
| 0.7944444444444444 | 0 |
| 0.7951388888888888 | 0 |
| 0.7958333333333334 | 0 |
| 0.7965277777777778 | 0 |
| 0.7972222222222222 | 0 |
| 0.7979166666666666 | 0 |
| 0.7986111111111112 | 0 |
| 0.7993055555555556 | 0 |
| 0.7999999999999999 | 0 |
| 0.8006944444444444 | 0 |
| 0.8013888888888889 | 0 |
| 0.8020833333333334 | 0 |
| 0.8027777777777777 | 0 |
| 0.8034722222222223 | 0 |
| 0.8041666666666667 | 0 |
| 0.8048611111111111 | 0 |
| 0.8055555555555555 | 0 |
| 0.80625 | 0 |
| 0.8069444444444445 | 0 |
| 0.8076388888888889 | 0 |
| 0.8083333333333332 | 0 |
| 0.8090277777777778 | 0 |
| 0.8097222222222222 | 0 |
| 0.8104166666666667 | 0 |
| 0.811111111111111 | 0 |
| 0.8118055555555556 | 0 |
| 0.8125 | 0 |
| 0.8131944444444444 | 0 |
| 0.813888888888889 | 0 |
| 0.8145833333333333 | 0 |
| 0.8152777777777778 | 0 |
| 0.8159722222222222 | 0 |
| 0.8166666666666668 | 0 |
| 0.8173611111111111 | 0 |
| 0.8180555555555555 | 0 |
| 0.81875 | 0 |
| 0.8194444444444445 | 0 |
| 0.8201388888888889 | 0 |
| 0.8208333333333333 | 0 |
| 0.8215277777777777 | 0 |
| 0.8222222222222223 | 0 |
| 0.8229166666666666 | 0 |
| 0.8236111111111111 | 0 |
| 0.8243055555555556 | 0 |
| 0.8250000000000001 | 0 |
| 0.8256944444444444 | 0 |
| 0.8263888888888888 | 0 |
| 0.8270833333333334 | 0 |
| 0.8277777777777778 | 0 |
| 0.8284722222222222 | 0 |
| 0.8291666666666666 | 0 |
| 0.8298611111111112 | 0 |
| 0.8305555555555556 | 0 |
| 0.8312499999999999 | 0 |
| 0.8319444444444444 | 0 |
| 0.8326388888888889 | 0 |
| 0.8333333333333334 | 0 |
| 0.8340277777777777 | 0 |
| 0.8347222222222223 | 0 |
| 0.8354166666666667 | 0 |
| 0.8361111111111111 | 0 |
| 0.8368055555555555 | 0 |
| 0.8375 | 0 |
| 0.8381944444444445 | 0 |
| 0.8388888888888889 | 0 |
| 0.8395833333333332 | 0 |
| 0.8402777777777778 | 0 |
| 0.8409722222222222 | 0 |
| 0.8416666666666667 | 0 |
| 0.842361111111111 | 0 |
| 0.8430555555555556 | 0 |
| 0.84375 | 0 |
| 0.8444444444444444 | 0 |
| 0.845138888888889 | 0 |
| 0.8458333333333333 | 0 |
| 0.8465277777777778 | 0 |
| 0.8472222222222222 | 0 |
| 0.8479166666666668 | 0 |
| 0.8486111111111111 | 0 |
| 0.8493055555555555 | 0 |
| 0.85 | 0 |
| 0.8506944444444445 | 0 |
| 0.8513888888888889 | 0 |
| 0.8520833333333333 | 0 |
| 0.8527777777777777 | 0 |
| 0.8534722222222223 | 0 |
| 0.8541666666666666 | 0 |
| 0.8548611111111111 | 0 |
| 0.8555555555555556 | 0 |
| 0.8562500000000001 | 0 |
| 0.8569444444444444 | 0 |
| 0.8576388888888888 | 0 |
| 0.8583333333333334 | 0 |
| 0.8590277777777778 | 0 |
| 0.8597222222222222 | 0 |
| 0.8604166666666666 | 0 |
| 0.8611111111111112 | 0 |
| 0.8618055555555556 | 0 |
| 0.8624999999999999 | 0 |
| 0.8631944444444444 | 0 |
| 0.8638888888888889 | 0 |
| 0.8645833333333334 | 0 |
| 0.8652777777777777 | 0 |
| 0.8659722222222223 | 0 |
| 0.8666666666666667 | 0 |
| 0.8673611111111111 | 0 |
| 0.8680555555555555 | 0 |
| 0.86875 | 0 |
| 0.8694444444444445 | 0 |
| 0.8701388888888889 | 0 |
| 0.8708333333333332 | 0 |
| 0.8715277777777778 | 0 |
| 0.8722222222222222 | 0 |
| 0.8729166666666667 | 0 |
| 0.873611111111111 | 0 |
| 0.8743055555555556 | 0 |
| 0.875 | 0 |
| 0.8756944444444444 | 0 |
| 0.876388888888889 | 0 |
| 0.8770833333333333 | 0 |
| 0.8777777777777778 | 0 |
| 0.8784722222222222 | 0 |
| 0.8791666666666668 | 0 |
| 0.8798611111111111 | 0 |
| 0.8805555555555555 | 0 |
| 0.88125 | 0 |
| 0.8819444444444445 | 0 |
| 0.8826388888888889 | 0 |
| 0.8833333333333333 | 0 |
| 0.8840277777777777 | 0 |
| 0.8847222222222223 | 0 |
| 0.8854166666666666 | 0 |
| 0.8861111111111111 | 0 |
| 0.8868055555555556 | 0 |
| 0.8875000000000001 | 0 |
| 0.8881944444444444 | 0 |
| 0.8888888888888888 | 0 |
| 0.8895833333333334 | 0 |
| 0.8902777777777778 | 0 |
| 0.8909722222222222 | 0 |
| 0.8916666666666666 | 0 |
| 0.8923611111111112 | 0 |
| 0.8930555555555556 | 0 |
| 0.8937499999999999 | 0 |
| 0.8944444444444444 | 0 |
| 0.8951388888888889 | 0 |
| 0.8958333333333334 | 0 |
| 0.8965277777777777 | 0 |
| 0.8972222222222223 | 0 |
| 0.8979166666666667 | 0 |
| 0.8986111111111111 | 0 |
| 0.8993055555555555 | 0 |
| 0.9 | 0 |
| 0.9006944444444445 | 0 |
| 0.9013888888888889 | 0 |
| 0.9020833333333332 | 0 |
| 0.9027777777777778 | 0 |
| 0.9034722222222222 | 0 |
| 0.9041666666666667 | 0 |
| 0.904861111111111 | 0 |
| 0.9055555555555556 | 0 |
| 0.90625 | 0 |
| 0.9069444444444444 | 0 |
| 0.907638888888889 | 0 |
| 0.9083333333333333 | 0 |
| 0.9090277777777778 | 0 |
| 0.9097222222222222 | 0 |
| 0.9104166666666668 | 0 |
| 0.9111111111111111 | 0 |
| 0.9118055555555555 | 0 |
| 0.9125 | 0 |
| 0.9131944444444445 | 0 |
| 0.9138888888888889 | 0 |
| 0.9145833333333333 | 0 |
| 0.9152777777777777 | 0 |
| 0.9159722222222223 | 0 |
| 0.9166666666666666 | 0 |
| 0.9173611111111111 | 0 |
| 0.9180555555555556 | 0 |
| 0.9187500000000001 | 0 |
| 0.9194444444444444 | 0 |
| 0.9201388888888888 | 0 |
| 0.9208333333333334 | 0 |
| 0.9215277777777778 | 0 |
| 0.9222222222222222 | 0 |
| 0.9229166666666666 | 0 |
| 0.9236111111111112 | 0 |
| 0.9243055555555556 | 0 |
| 0.9249999999999999 | 0 |
| 0.9256944444444444 | 0 |
| 0.9263888888888889 | 0 |
| 0.9270833333333334 | 0 |
| 0.9277777777777777 | 0 |
| 0.9284722222222223 | 0 |
| 0.9291666666666667 | 0 |
| 0.9298611111111111 | 0 |
| 0.9305555555555555 | 0 |
| 0.93125 | 0 |
| 0.9319444444444445 | 0 |
| 0.9326388888888889 | 0 |
| 0.9333333333333332 | 0 |
| 0.9340277777777778 | 0 |
| 0.9347222222222222 | 0 |
| 0.9354166666666667 | 0 |
| 0.936111111111111 | 0 |
| 0.9368055555555556 | 0 |
| 0.9375 | 0 |
| 0.9381944444444444 | 0 |
| 0.938888888888889 | 0 |
| 0.9395833333333333 | 0 |
| 0.9402777777777778 | 0 |
| 0.9409722222222222 | 0 |
| 0.9416666666666668 | 0 |
| 0.9423611111111111 | 0 |
| 0.9430555555555555 | 0 |
| 0.94375 | 0 |
| 0.9444444444444445 | 0 |
| 0.9451388888888889 | 0 |
| 0.9458333333333333 | 0 |
| 0.9465277777777777 | 0 |
| 0.9472222222222223 | 0 |
| 0.9479166666666666 | 0 |
| 0.9486111111111111 | 0 |
| 0.9493055555555556 | 0 |
| 0.9500000000000001 | 0 |
| 0.9506944444444444 | 0 |
| 0.9513888888888888 | 0 |
| 0.9520833333333334 | 0 |
| 0.9527777777777778 | 0 |
| 0.9534722222222222 | 0 |
| 0.9541666666666666 | 0 |
| 0.9548611111111112 | 0 |
| 0.9555555555555556 | 0 |
| 0.9562499999999999 | 0 |
| 0.9569444444444444 | 0 |
| 0.9576388888888889 | 0 |
| 0.9583333333333334 | 0 |
| 0.9590277777777777 | 0 |
| 0.9597222222222223 | 0 |
| 0.9604166666666667 | 0 |
| 0.9611111111111111 | 0 |
| 0.9618055555555555 | 0 |
| 0.9625 | 0 |
| 0.9631944444444445 | 0 |
| 0.9638888888888889 | 0 |
| 0.9645833333333332 | 0 |
| 0.9652777777777778 | 0 |
| 0.9659722222222222 | 0 |
| 0.9666666666666667 | 0 |
| 0.967361111111111 | 0 |
| 0.9680555555555556 | 0 |
| 0.96875 | 0 |
| 0.9694444444444444 | 0 |
| 0.970138888888889 | 0 |
| 0.9708333333333333 | 0 |
| 0.9715277777777778 | 0 |
| 0.9722222222222222 | 0 |
| 0.9729166666666668 | 0 |
| 0.9736111111111111 | 0 |
| 0.9743055555555555 | 0 |
| 0.975 | 0 |
| 0.9756944444444445 | 0 |
| 0.9763888888888889 | 0 |
| 0.9770833333333333 | 0 |
| 0.9777777777777777 | 0 |
| 0.9784722222222223 | 0 |
| 0.9791666666666666 | 0 |
| 0.9798611111111111 | 0 |
| 0.9805555555555556 | 0 |
| 0.9812500000000001 | 0 |
| 0.9819444444444444 | 0 |
| 0.9826388888888888 | 0 |
| 0.9833333333333334 | 0 |
| 0.9840277777777778 | 0 |
| 0.9847222222222222 | 0 |
| 0.9854166666666666 | 0 |
| 0.9861111111111112 | 0 |
| 0.9868055555555556 | 0 |
| 0.9874999999999999 | 0 |
| 0.9881944444444444 | 0 |
| 0.9888888888888889 | 0 |
| 0.9895833333333334 | 0 |
| 0.9902777777777777 | 0 |
| 0.9909722222222223 | 0 |
| 0.9916666666666667 | 0 |
| 0.9923611111111111 | 0 |
| 0.9930555555555555 | 0 |
| 0.99375 | 0 |
| 0.9944444444444445 | 0 |
| 0.9951388888888889 | 0 |
| 0.9958333333333332 | 0 |
| 0.9965277777777778 | 0 |
| 0.9972222222222222 | 0 |
| 0.9979166666666667 | 0 |
| 0.998611111111111 | 0 |
| 0.9993055555555556 | 0 |